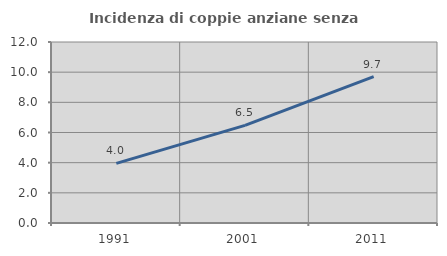
| Category | Incidenza di coppie anziane senza figli  |
|---|---|
| 1991.0 | 3.953 |
| 2001.0 | 6.472 |
| 2011.0 | 9.705 |